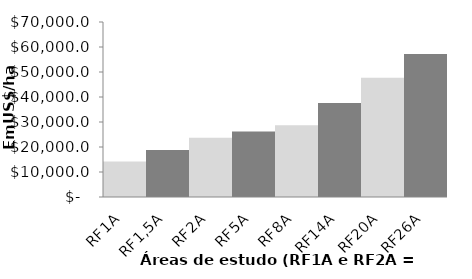
| Category | Series 0 |
|---|---|
| RF1A | 14216.781 |
| RF1,5A | 18779.519 |
| RF2A | 23670.902 |
| RF5A | 26156.89 |
| RF8A | 28670.571 |
| RF14A | 37567.251 |
| RF20A | 47712.051 |
| RF26A | 57237.782 |